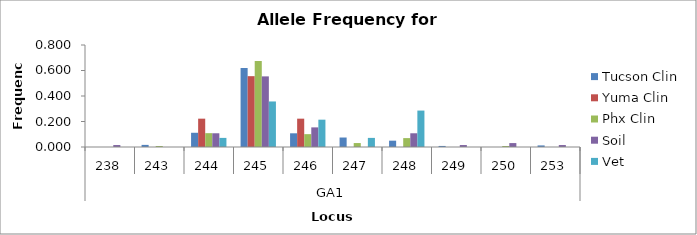
| Category | Tucson Clin | Yuma Clin | Phx Clin | Soil | Vet |
|---|---|---|---|---|---|
| 0 | 0 | 0 | 0 | 0.015 | 0 |
| 1 | 0.017 | 0 | 0.008 | 0 | 0 |
| 2 | 0.112 | 0.222 | 0.109 | 0.108 | 0.071 |
| 3 | 0.62 | 0.556 | 0.674 | 0.554 | 0.357 |
| 4 | 0.107 | 0.222 | 0.101 | 0.154 | 0.214 |
| 5 | 0.074 | 0 | 0.031 | 0 | 0.071 |
| 6 | 0.05 | 0 | 0.07 | 0.108 | 0.286 |
| 7 | 0.008 | 0 | 0 | 0.015 | 0 |
| 8 | 0 | 0 | 0.008 | 0.031 | 0 |
| 9 | 0.012 | 0 | 0 | 0.015 | 0 |